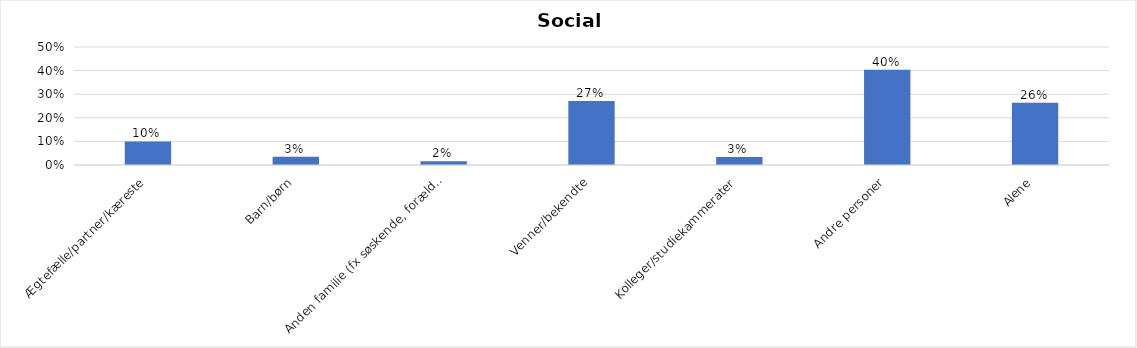
| Category | % |
|---|---|
| Ægtefælle/partner/kæreste | 0.1 |
| Barn/børn | 0.035 |
| Anden familie (fx søskende, forældre) | 0.016 |
| Venner/bekendte | 0.271 |
| Kolleger/studiekammerater | 0.034 |
| Andre personer | 0.404 |
| Alene | 0.263 |